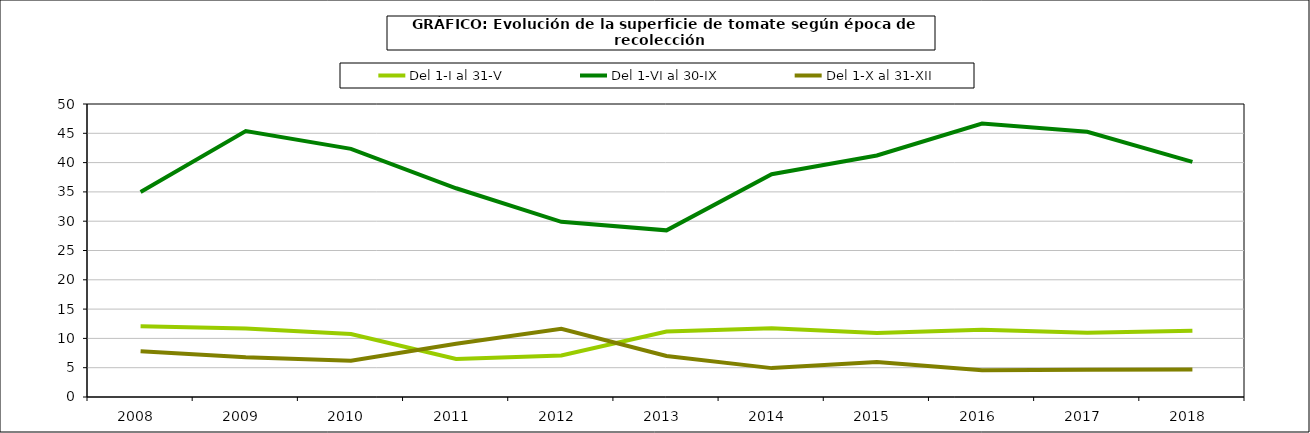
| Category | Del 1-I al 31-V | Del 1-VI al 30-IX | Del 1-X al 31-XII |
|---|---|---|---|
| 2008.0 | 12.07 | 34.991 | 7.807 |
| 2009.0 | 11.671 | 45.383 | 6.784 |
| 2010.0 | 10.742 | 42.349 | 6.176 |
| 2011.0 | 6.491 | 35.62 | 9.093 |
| 2012.0 | 7.086 | 29.889 | 11.641 |
| 2013.0 | 11.18 | 28.439 | 7.005 |
| 2014.0 | 11.722 | 38.024 | 4.929 |
| 2015.0 | 10.934 | 41.208 | 5.992 |
| 2016.0 | 11.479 | 46.659 | 4.577 |
| 2017.0 | 10.948 | 45.266 | 4.638 |
| 2018.0 | 11.31 | 40.134 | 4.684 |